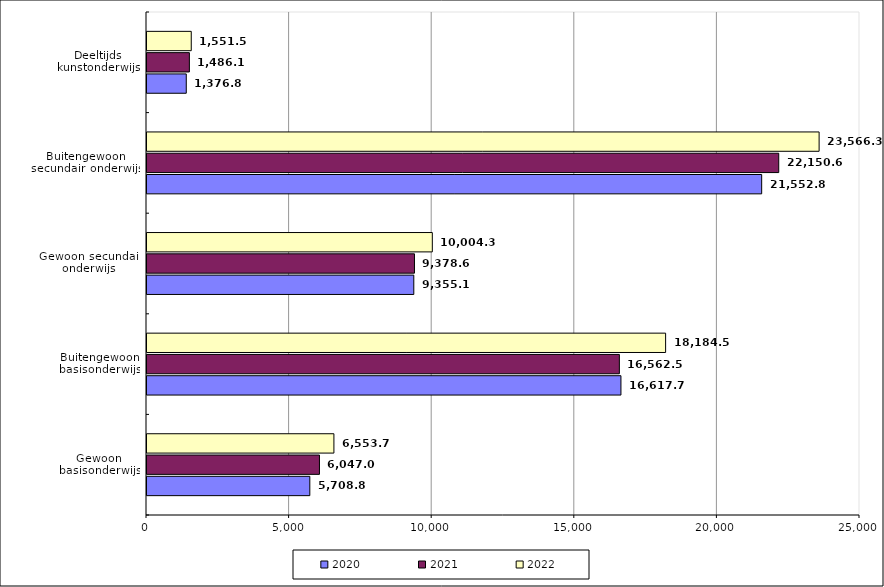
| Category | 2020 | 2021 | 2022 |
|---|---|---|---|
| Gewoon basisonderwijs | 5708.852 | 6047.029 | 6553.768 |
| Buitengewoon basisonderwijs | 16617.779 | 16562.586 | 18184.556 |
| Gewoon secundair onderwijs | 9355.105 | 9378.633 | 10004.339 |
| Buitengewoon secundair onderwijs | 21552.81 | 22150.655 | 23566.394 |
| Deeltijds kunstonderwijs | 1376.872 | 1486.159 | 1551.578 |